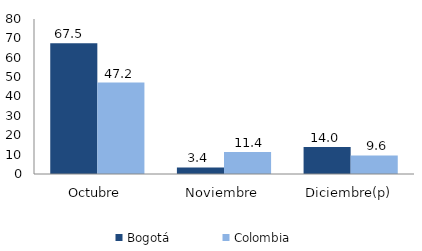
| Category | Bogotá | Colombia |
|---|---|---|
| Octubre | 67.525 | 47.199 |
| Noviembre | 3.365 | 11.391 |
| Diciembre(p) | 13.986 | 9.598 |